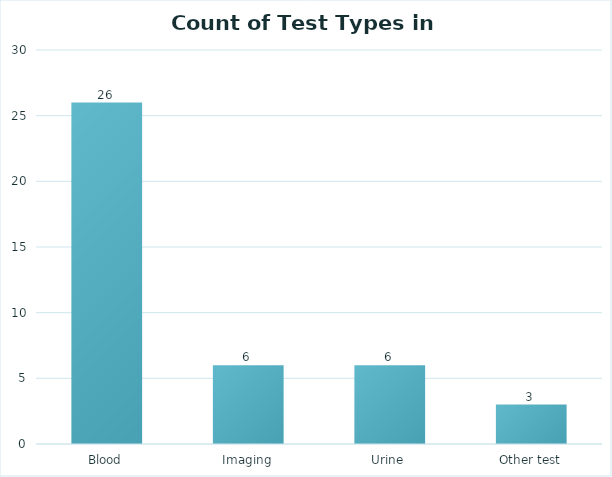
| Category | Count of Test Type |
|---|---|
| Blood | 26 |
| Imaging | 6 |
| Urine | 6 |
| Other test | 3 |